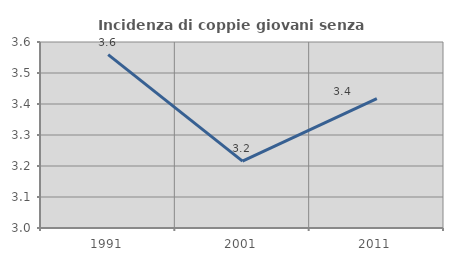
| Category | Incidenza di coppie giovani senza figli |
|---|---|
| 1991.0 | 3.559 |
| 2001.0 | 3.216 |
| 2011.0 | 3.418 |